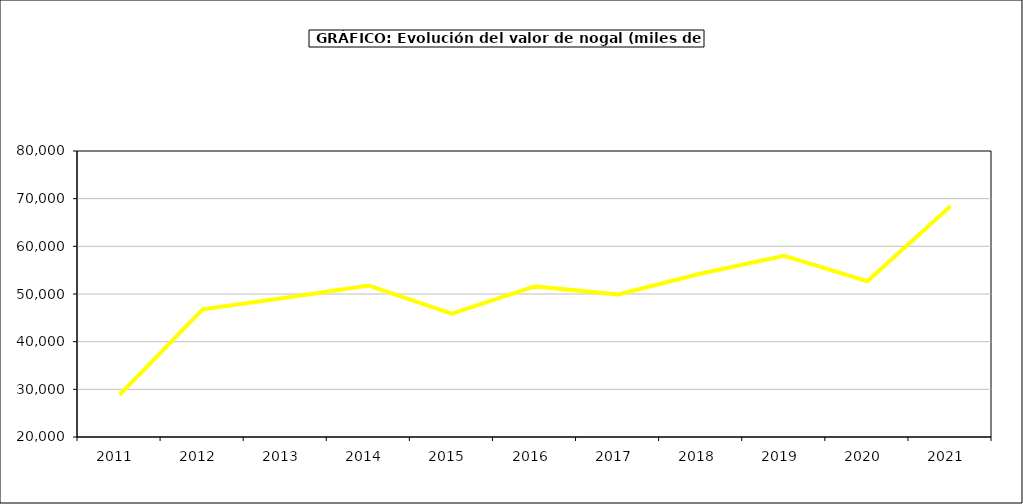
| Category | valor nogal |
|---|---|
| 2011.0 | 28841.576 |
| 2012.0 | 46777.981 |
| 2013.0 | 49217.301 |
| 2014.0 | 51776.04 |
| 2015.0 | 45857 |
| 2016.0 | 51595 |
| 2017.0 | 49891.162 |
| 2018.0 | 54304.281 |
| 2019.0 | 58028.936 |
| 2020.0 | 52678.304 |
| 2021.0 | 68411.221 |